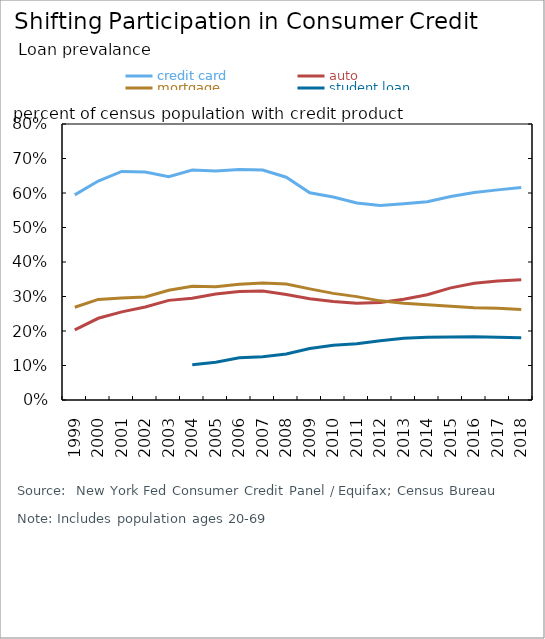
| Category | credit card | auto | mortgage |
|---|---|---|---|
| 1999.0 | 0.595 | 0.203 | 0.269 |
| 2000.0 | 0.635 | 0.237 | 0.291 |
| 2001.0 | 0.662 | 0.255 | 0.296 |
| 2002.0 | 0.661 | 0.27 | 0.299 |
| 2003.0 | 0.647 | 0.289 | 0.318 |
| 2004.0 | 0.667 | 0.295 | 0.33 |
| 2005.0 | 0.664 | 0.308 | 0.328 |
| 2006.0 | 0.668 | 0.314 | 0.335 |
| 2007.0 | 0.667 | 0.316 | 0.339 |
| 2008.0 | 0.646 | 0.306 | 0.336 |
| 2009.0 | 0.601 | 0.293 | 0.322 |
| 2010.0 | 0.588 | 0.285 | 0.309 |
| 2011.0 | 0.571 | 0.281 | 0.3 |
| 2012.0 | 0.564 | 0.282 | 0.287 |
| 2013.0 | 0.569 | 0.292 | 0.28 |
| 2014.0 | 0.575 | 0.305 | 0.276 |
| 2015.0 | 0.59 | 0.325 | 0.272 |
| 2016.0 | 0.601 | 0.338 | 0.268 |
| 2017.0 | 0.609 | 0.345 | 0.266 |
| 2018.0 | 0.616 | 0.349 | 0.262 |